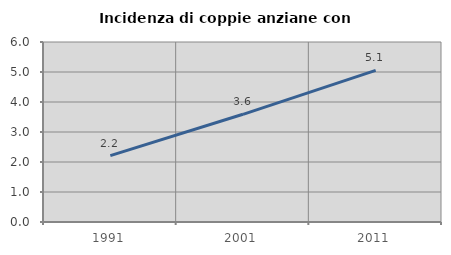
| Category | Incidenza di coppie anziane con figli |
|---|---|
| 1991.0 | 2.214 |
| 2001.0 | 3.59 |
| 2011.0 | 5.053 |